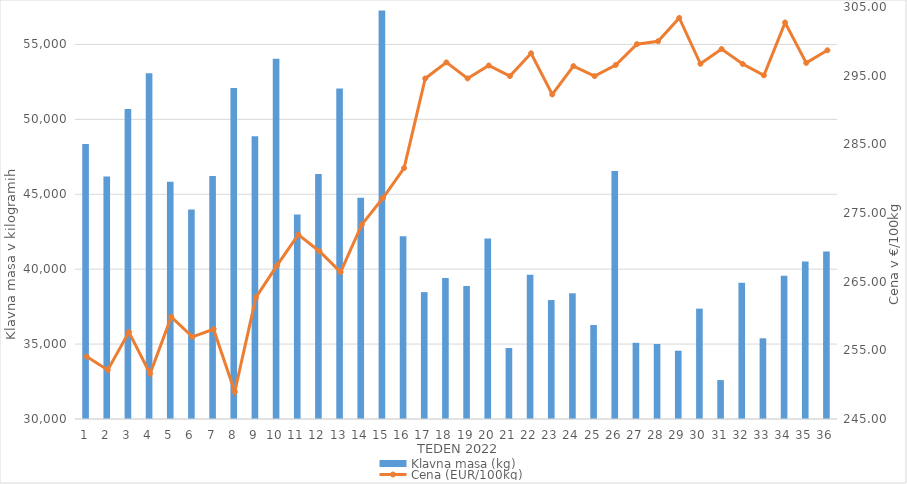
| Category | Klavna masa (kg) |
|---|---|
| 1.0 | 48349 |
| 2.0 | 46187 |
| 3.0 | 50692 |
| 4.0 | 53081 |
| 5.0 | 45844 |
| 6.0 | 43982 |
| 7.0 | 46227 |
| 8.0 | 52099 |
| 9.0 | 48872 |
| 10.0 | 54045 |
| 11.0 | 43645 |
| 12.0 | 46350 |
| 13.0 | 52061 |
| 14.0 | 44774 |
| 15.0 | 57268 |
| 16.0 | 42191 |
| 17.0 | 38469 |
| 18.0 | 39417 |
| 19.0 | 38876 |
| 20.0 | 42047 |
| 21.0 | 34739 |
| 22.0 | 39626 |
| 23.0 | 37939 |
| 24.0 | 38390 |
| 25.0 | 36272 |
| 26.0 | 46553 |
| 27.0 | 35085 |
| 28.0 | 35007 |
| 29.0 | 34559 |
| 30.0 | 37366 |
| 31.0 | 32599 |
| 32.0 | 39100 |
| 33.0 | 35388 |
| 34.0 | 39563 |
| 35.0 | 40507 |
| 36.0 | 41176 |